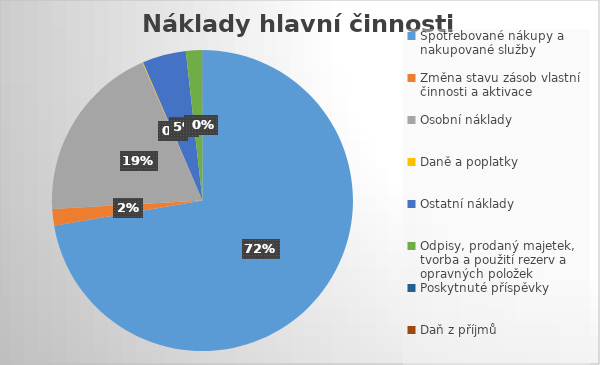
| Category | Series 0 |
|---|---|
| Spotřebované nákupy a nakupované služby | 80601 |
| Změna stavu zásob vlastní činnosti a aktivace | 1977 |
| Osobní náklady | 21591 |
| Daně a poplatky | 90 |
| Ostatní náklady | 5221 |
| Odpisy, prodaný majetek, tvorba a použití rezerv a opravných položek | 1938 |
| Poskytnuté příspěvky | 40 |
| Daň z příjmů | 0 |